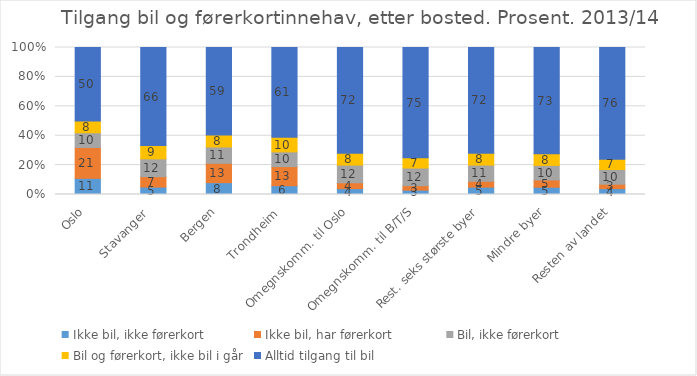
| Category | Ikke bil, ikke førerkort | Ikke bil, har førerkort | Bil, ikke førerkort | Bil og førerkort, ikke bil i går | Alltid tilgang til bil |
|---|---|---|---|---|---|
| Oslo | 11 | 21 | 10 | 8 | 50 |
| Stavanger  | 5 | 7 | 12 | 9 | 66 |
| Bergen | 8 | 13 | 11 | 8 | 59 |
| Trondheim  | 6 | 13 | 10 | 10 | 61 |
| Omegnskomm. til Oslo | 4 | 4 | 12 | 8 | 72 |
| Omegnskomm. til B/T/S | 3 | 3 | 12 | 7 | 75 |
| Rest. seks største byer | 5 | 4 | 11 | 8 | 72 |
| Mindre byer | 5 | 5 | 10 | 8 | 73 |
| Resten av landet | 4 | 3 | 10 | 7 | 76 |